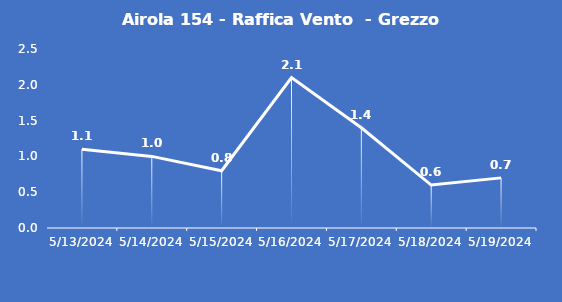
| Category | Airola 154 - Raffica Vento  - Grezzo (m/s) |
|---|---|
| 5/13/24 | 1.1 |
| 5/14/24 | 1 |
| 5/15/24 | 0.8 |
| 5/16/24 | 2.1 |
| 5/17/24 | 1.4 |
| 5/18/24 | 0.6 |
| 5/19/24 | 0.7 |